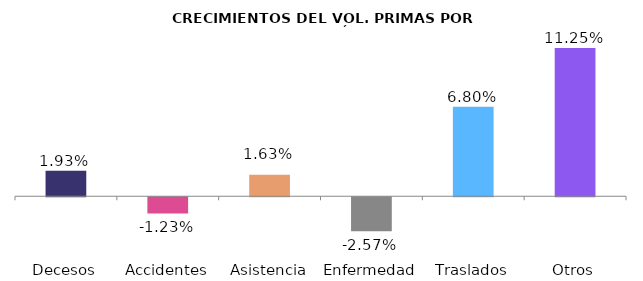
| Category | Series 0 |
|---|---|
| Decesos | 0.019 |
| Accidentes | -0.012 |
| Asistencia | 0.016 |
| Enfermedad | -0.026 |
| Traslados | 0.068 |
| Otros | 0.112 |